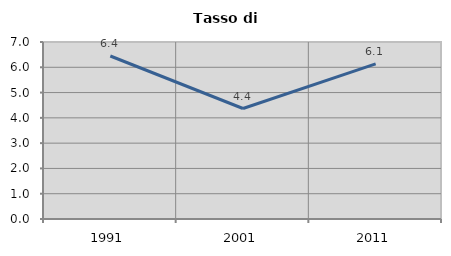
| Category | Tasso di disoccupazione   |
|---|---|
| 1991.0 | 6.446 |
| 2001.0 | 4.37 |
| 2011.0 | 6.137 |